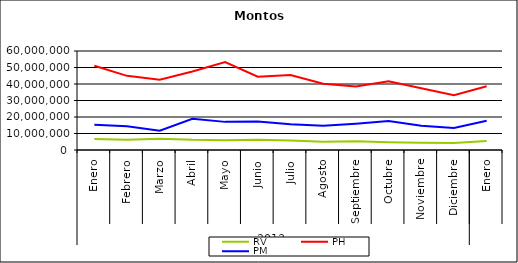
| Category | RV | PH | PM |
|---|---|---|---|
| 0 | 6603412.357 | 51097257.501 | 15291994.497 |
| 1 | 6144371.716 | 44938482.89 | 14418861.164 |
| 2 | 6870539.137 | 42574717.992 | 11735480.075 |
| 3 | 6139858.354 | 47535968.024 | 18924825.739 |
| 4 | 5890476.617 | 53273527.932 | 17047621.863 |
| 5 | 6142686.449 | 44450017.2 | 17254269.094 |
| 6 | 5792277.798 | 45481930.674 | 15546714.502 |
| 7 | 4962192.427 | 40196203.529 | 14644148.591 |
| 8 | 5244267.415 | 38549056.812 | 15946518.356 |
| 9 | 4723321.466 | 41614732.22 | 17536811.707 |
| 10 | 4437368.656 | 37439358.84 | 14761398.421 |
| 11 | 4226608.984 | 33178083.97 | 13384599.022 |
| 12 | 5420667.417 | 38592535.269 | 17738595.757 |